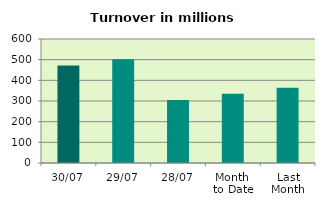
| Category | Series 0 |
|---|---|
| 30/07 | 471.17 |
| 29/07 | 502.295 |
| 28/07 | 304.363 |
| Month 
to Date | 334.97 |
| Last
Month | 364.182 |